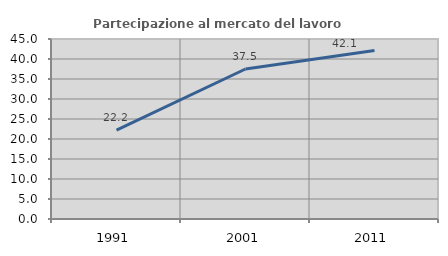
| Category | Partecipazione al mercato del lavoro  femminile |
|---|---|
| 1991.0 | 22.222 |
| 2001.0 | 37.5 |
| 2011.0 | 42.105 |